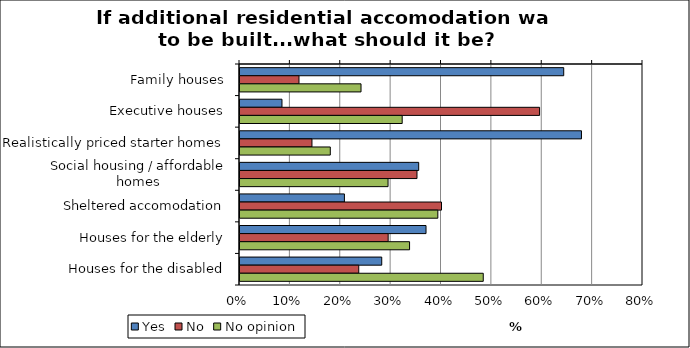
| Category | Yes | No | No opinion |
|---|---|---|---|
| Family houses | 0.643 | 0.117 | 0.24 |
| Executive houses | 0.083 | 0.595 | 0.322 |
| Realistically priced starter homes | 0.678 | 0.143 | 0.179 |
| Social housing / affordable homes | 0.355 | 0.351 | 0.294 |
| Sheltered accomodation | 0.207 | 0.4 | 0.393 |
| Houses for the elderly | 0.369 | 0.294 | 0.337 |
| Houses for the disabled | 0.281 | 0.236 | 0.483 |